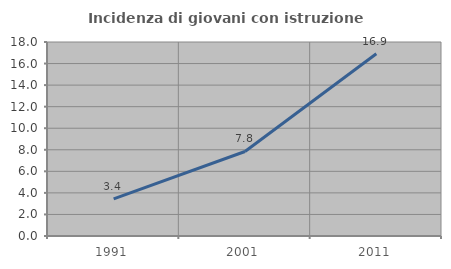
| Category | Incidenza di giovani con istruzione universitaria |
|---|---|
| 1991.0 | 3.441 |
| 2001.0 | 7.843 |
| 2011.0 | 16.915 |